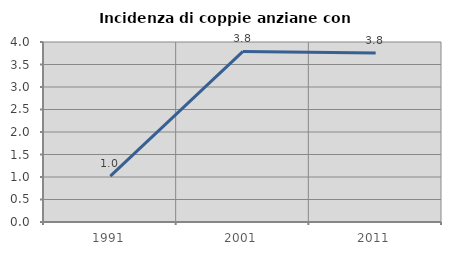
| Category | Incidenza di coppie anziane con figli |
|---|---|
| 1991.0 | 1.02 |
| 2001.0 | 3.791 |
| 2011.0 | 3.756 |